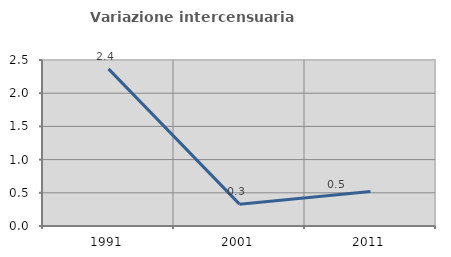
| Category | Variazione intercensuaria annua |
|---|---|
| 1991.0 | 2.366 |
| 2001.0 | 0.329 |
| 2011.0 | 0.519 |